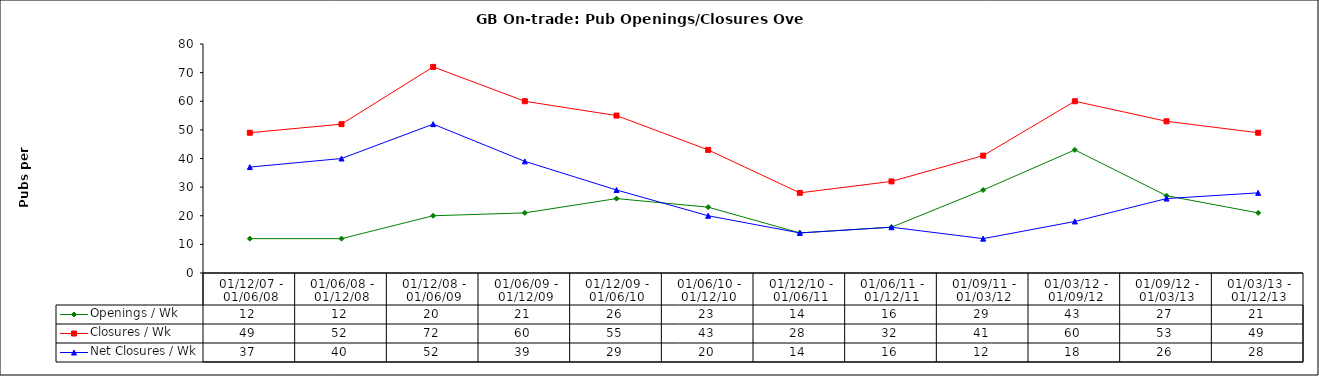
| Category | Openings / Wk | Closures / Wk | Net Closures / Wk   |
|---|---|---|---|
| 01/12/07 - 01/06/08 | 12 | 49 | 37 |
| 01/06/08 - 01/12/08 | 12 | 52 | 40 |
| 01/12/08 - 01/06/09 | 20 | 72 | 52 |
| 01/06/09 - 01/12/09 | 21 | 60 | 39 |
| 01/12/09 - 01/06/10 | 26 | 55 | 29 |
| 01/06/10 - 01/12/10 | 23 | 43 | 20 |
| 01/12/10 - 01/06/11 | 14 | 28 | 14 |
| 01/06/11 - 01/12/11 | 16 | 32 | 16 |
| 01/09/11 - 01/03/12 | 29 | 41 | 12 |
| 01/03/12 - 01/09/12 | 43 | 60 | 18 |
| 01/09/12 - 01/03/13 | 27 | 53 | 26 |
| 01/03/13 - 01/12/13 | 21 | 49 | 28 |